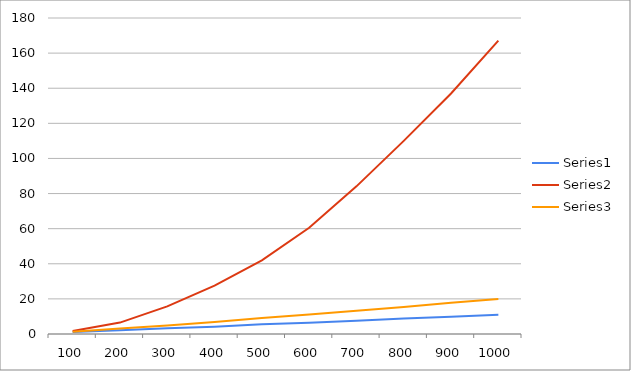
| Category | Series 0 | Series 1 | Series 2 |
|---|---|---|---|
| 100.0 | 1.2 | 1.7 | 1.3 |
| 200.0 | 2.1 | 6.5 | 3.1 |
| 300.0 | 3.3 | 15.7 | 4.9 |
| 400.0 | 4.2 | 27.6 | 6.9 |
| 500.0 | 5.6 | 41.9 | 9.1 |
| 600.0 | 6.4 | 60.5 | 11.1 |
| 700.0 | 7.5 | 84.1 | 13.2 |
| 800.0 | 8.8 | 110 | 15.4 |
| 900.0 | 9.8 | 137 | 17.8 |
| 1000.0 | 10.9 | 167.1 | 19.9 |